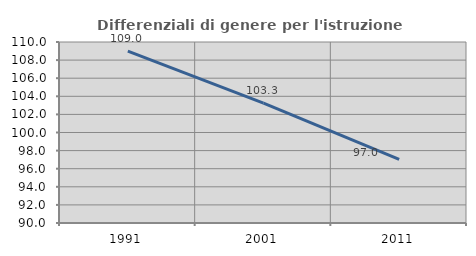
| Category | Differenziali di genere per l'istruzione superiore |
|---|---|
| 1991.0 | 108.981 |
| 2001.0 | 103.255 |
| 2011.0 | 97.019 |